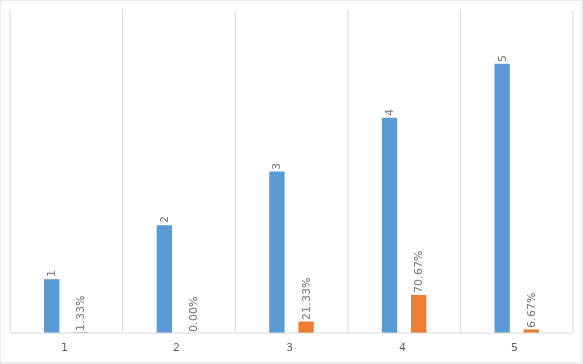
| Category | Series 0 | Series 1 |
|---|---|---|
| 0 | 1 | 0.013 |
| 1 | 2 | 0 |
| 2 | 3 | 0.213 |
| 3 | 4 | 0.707 |
| 4 | 5 | 0.067 |